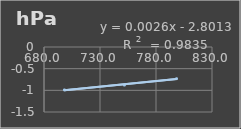
| Category | Presión Atmosférica |
|---|---|
| 698.2 | -0.99 |
| 751.8 | -0.88 |
| 798.4 | -0.73 |